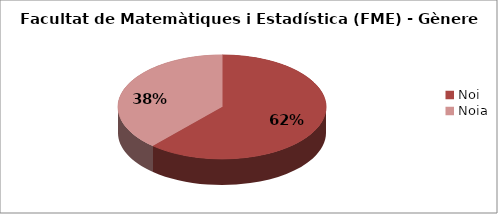
| Category | Facultat de Matemàtiques i Estadística (FME) - Gènere |
|---|---|
| Noi | 0.615 |
| Noia | 0.385 |